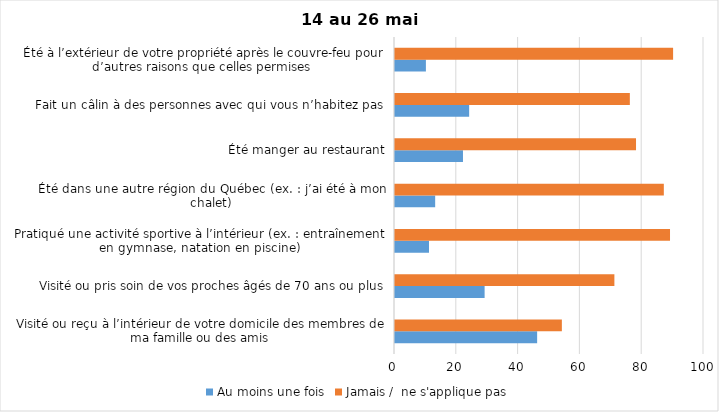
| Category | Au moins une fois | Jamais /  ne s'applique pas |
|---|---|---|
| Visité ou reçu à l’intérieur de votre domicile des membres de ma famille ou des amis | 46 | 54 |
| Visité ou pris soin de vos proches âgés de 70 ans ou plus | 29 | 71 |
| Pratiqué une activité sportive à l’intérieur (ex. : entraînement en gymnase, natation en piscine) | 11 | 89 |
| Été dans une autre région du Québec (ex. : j’ai été à mon chalet) | 13 | 87 |
| Été manger au restaurant | 22 | 78 |
| Fait un câlin à des personnes avec qui vous n’habitez pas | 24 | 76 |
| Été à l’extérieur de votre propriété après le couvre-feu pour d’autres raisons que celles permises  | 10 | 90 |